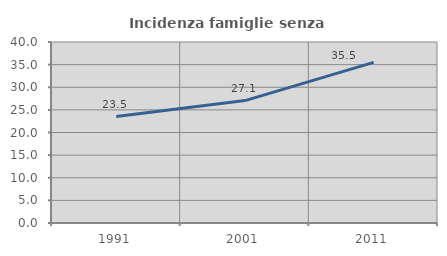
| Category | Incidenza famiglie senza nuclei |
|---|---|
| 1991.0 | 23.514 |
| 2001.0 | 27.053 |
| 2011.0 | 35.486 |